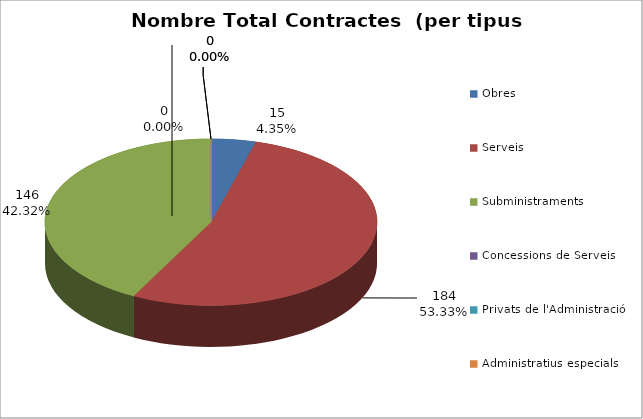
| Category | Nombre Total Contractes |
|---|---|
| Obres | 15 |
| Serveis | 184 |
| Subministraments | 146 |
| Concessions de Serveis | 0 |
| Privats de l'Administració | 0 |
| Administratius especials | 0 |